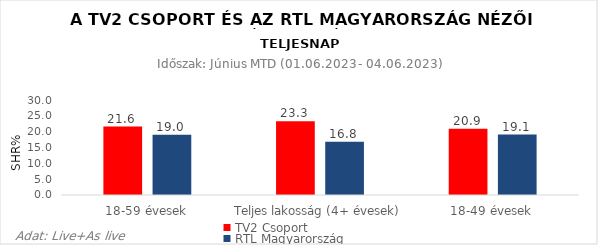
| Category | TV2 Csoport | RTL Magyarország |
|---|---|---|
| 18-59 évesek | 21.6 | 19 |
| Teljes lakosság (4+ évesek) | 23.3 | 16.8 |
| 18-49 évesek | 20.9 | 19.1 |